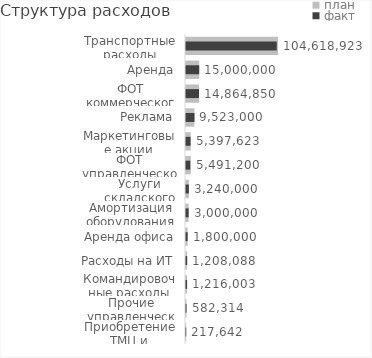
| Category | план |
|---|---|
| Приобретение ТМЦ и материалов | 217642 |
| Прочие управленческие расходы | 582314 |
| Командировочные расходы | 1216003 |
| Расходы на ИТ | 1208088 |
| Аренда офиса | 1800000 |
| Амортизация оборудования | 3000000 |
| Услуги складского хранения | 3240000 |
| ФОТ управленческого персонала | 5491200 |
| Маркетинговые акции | 5397622.836 |
| Реклама | 9523000 |
| ФОТ коммерческого персонала | 14864850 |
| Аренда | 15000000 |
| Транспортные расходы | 104618923.196 |